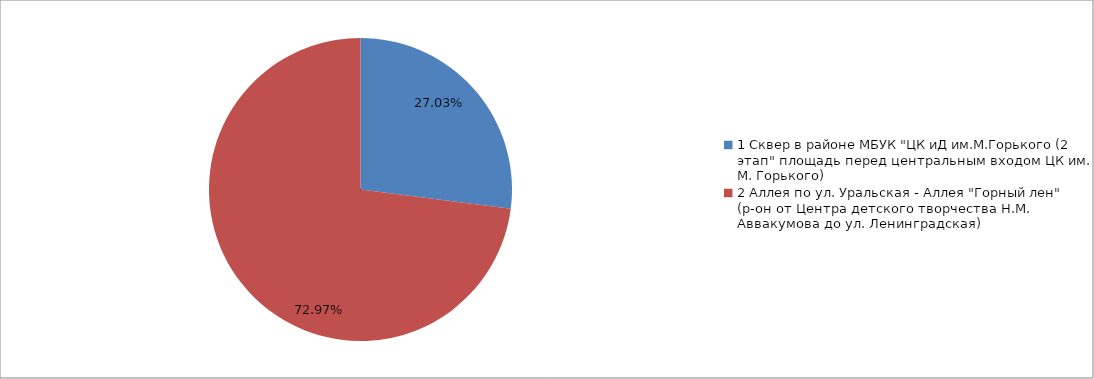
| Category | Series 0 |
|---|---|
| 1 Сквер в районе МБУК "ЦК иД им.М.Горького (2 этап" площадь перед центральным входом ЦК им. М. Горького) | 0.27 |
| 2 Аллея по ул. Уральская - Аллея "Горный лен" (р-он от Центра детского творчества Н.М. Аввакумова до ул. Ленинградская) | 0.73 |